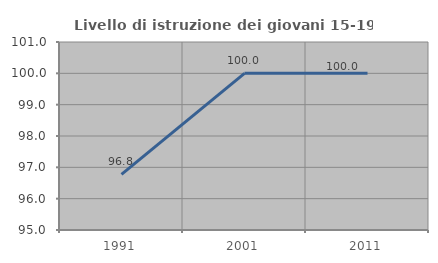
| Category | Livello di istruzione dei giovani 15-19 anni |
|---|---|
| 1991.0 | 96.774 |
| 2001.0 | 100 |
| 2011.0 | 100 |